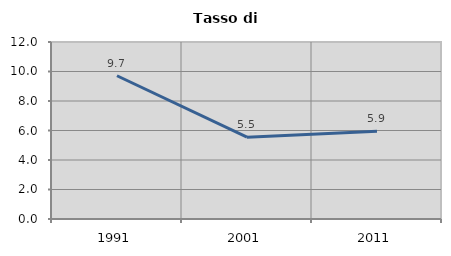
| Category | Tasso di disoccupazione   |
|---|---|
| 1991.0 | 9.713 |
| 2001.0 | 5.549 |
| 2011.0 | 5.946 |